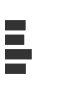
| Category | Series 0 |
|---|---|
| 0 | 0.307 |
| 1 | 0.285 |
| 2 | 0.403 |
| 3 | 0.311 |